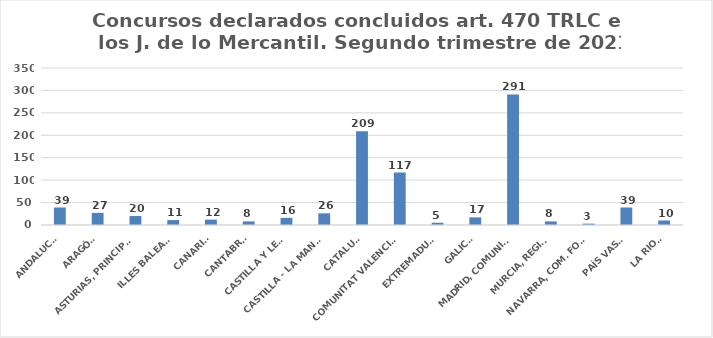
| Category | Series 0 |
|---|---|
| ANDALUCÍA | 39 |
| ARAGÓN | 27 |
| ASTURIAS, PRINCIPADO | 20 |
| ILLES BALEARS | 11 |
| CANARIAS | 12 |
| CANTABRIA | 8 |
| CASTILLA Y LEÓN | 16 |
| CASTILLA - LA MANCHA | 26 |
| CATALUÑA | 209 |
| COMUNITAT VALENCIANA | 117 |
| EXTREMADURA | 5 |
| GALICIA | 17 |
| MADRID, COMUNIDAD | 291 |
| MURCIA, REGIÓN | 8 |
| NAVARRA, COM. FORAL | 3 |
| PAÍS VASCO | 39 |
| LA RIOJA | 10 |